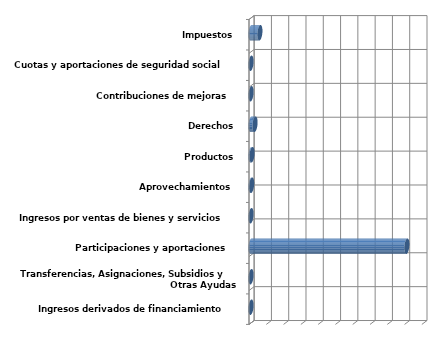
| Category | Series 0 |
|---|---|
| Ingresos derivados de financiamiento | 0 |
| Transferencias, Asignaciones, Subsidios y Otras Ayudas | 0 |
| Participaciones y aportaciones | 18032678 |
| Ingresos por ventas de bienes y servicios | 0 |
| Aprovechamientos | 70615 |
| Productos | 115779 |
| Derechos | 466787 |
| Contribuciones de mejoras | 2000 |
| Cuotas y aportaciones de seguridad social | 0 |
| Impuestos | 1028169 |